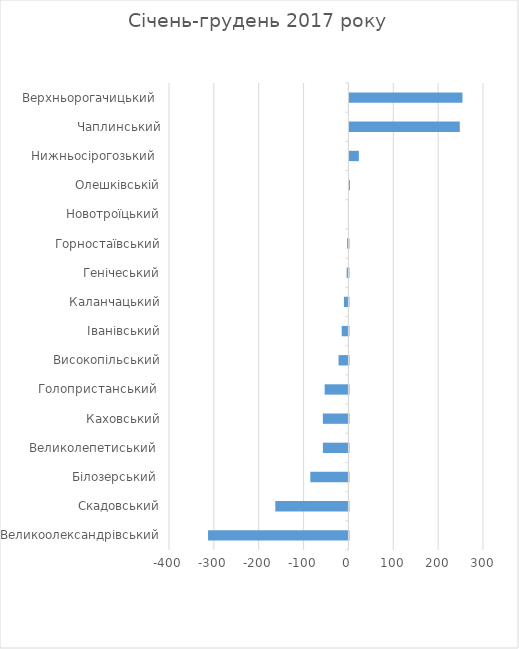
| Category | Series 0 |
|---|---|
| Великоолександрівський | -313 |
| Скадовський | -163 |
| Білозерський  | -85 |
| Великолепетиський  | -57 |
| Каховський | -57 |
| Голопристанський  | -53 |
| Високопільський | -22 |
| Іванівський | -15 |
| Каланчацький | -10 |
| Генічеський | -4 |
| Горностаївський | -3 |
| Новотроїцький | 0 |
| Олешківській | 1 |
| Нижньосірогозький  | 21 |
| Чаплинський | 246 |
| Верхньорогачицький  | 252 |